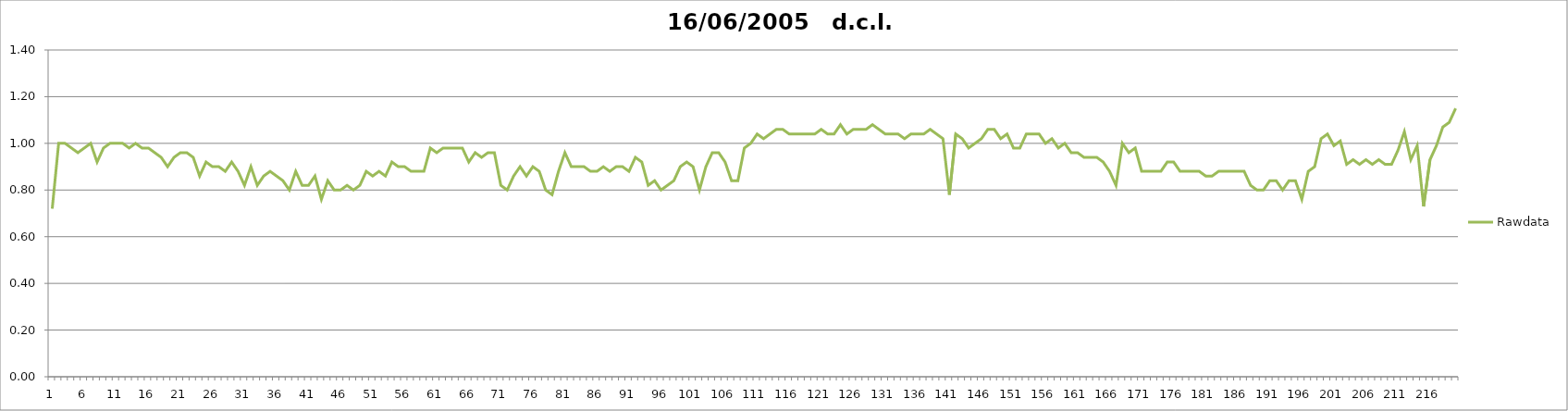
| Category | Rawdata |
|---|---|
| 0 | 0.72 |
| 1 | 1 |
| 2 | 1 |
| 3 | 0.98 |
| 4 | 0.96 |
| 5 | 0.98 |
| 6 | 1 |
| 7 | 0.92 |
| 8 | 0.98 |
| 9 | 1 |
| 10 | 1 |
| 11 | 1 |
| 12 | 0.98 |
| 13 | 1 |
| 14 | 0.98 |
| 15 | 0.98 |
| 16 | 0.96 |
| 17 | 0.94 |
| 18 | 0.9 |
| 19 | 0.94 |
| 20 | 0.96 |
| 21 | 0.96 |
| 22 | 0.94 |
| 23 | 0.86 |
| 24 | 0.92 |
| 25 | 0.9 |
| 26 | 0.9 |
| 27 | 0.88 |
| 28 | 0.92 |
| 29 | 0.88 |
| 30 | 0.82 |
| 31 | 0.9 |
| 32 | 0.82 |
| 33 | 0.86 |
| 34 | 0.88 |
| 35 | 0.86 |
| 36 | 0.84 |
| 37 | 0.8 |
| 38 | 0.88 |
| 39 | 0.82 |
| 40 | 0.82 |
| 41 | 0.86 |
| 42 | 0.76 |
| 43 | 0.84 |
| 44 | 0.8 |
| 45 | 0.8 |
| 46 | 0.82 |
| 47 | 0.8 |
| 48 | 0.82 |
| 49 | 0.88 |
| 50 | 0.86 |
| 51 | 0.88 |
| 52 | 0.86 |
| 53 | 0.92 |
| 54 | 0.9 |
| 55 | 0.9 |
| 56 | 0.88 |
| 57 | 0.88 |
| 58 | 0.88 |
| 59 | 0.98 |
| 60 | 0.96 |
| 61 | 0.98 |
| 62 | 0.98 |
| 63 | 0.98 |
| 64 | 0.98 |
| 65 | 0.92 |
| 66 | 0.96 |
| 67 | 0.94 |
| 68 | 0.96 |
| 69 | 0.96 |
| 70 | 0.82 |
| 71 | 0.8 |
| 72 | 0.86 |
| 73 | 0.9 |
| 74 | 0.86 |
| 75 | 0.9 |
| 76 | 0.88 |
| 77 | 0.8 |
| 78 | 0.78 |
| 79 | 0.88 |
| 80 | 0.96 |
| 81 | 0.9 |
| 82 | 0.9 |
| 83 | 0.9 |
| 84 | 0.88 |
| 85 | 0.88 |
| 86 | 0.9 |
| 87 | 0.88 |
| 88 | 0.9 |
| 89 | 0.9 |
| 90 | 0.88 |
| 91 | 0.94 |
| 92 | 0.92 |
| 93 | 0.82 |
| 94 | 0.84 |
| 95 | 0.8 |
| 96 | 0.82 |
| 97 | 0.84 |
| 98 | 0.9 |
| 99 | 0.92 |
| 100 | 0.9 |
| 101 | 0.8 |
| 102 | 0.9 |
| 103 | 0.96 |
| 104 | 0.96 |
| 105 | 0.92 |
| 106 | 0.84 |
| 107 | 0.84 |
| 108 | 0.98 |
| 109 | 1 |
| 110 | 1.04 |
| 111 | 1.02 |
| 112 | 1.04 |
| 113 | 1.06 |
| 114 | 1.06 |
| 115 | 1.04 |
| 116 | 1.04 |
| 117 | 1.04 |
| 118 | 1.04 |
| 119 | 1.04 |
| 120 | 1.06 |
| 121 | 1.04 |
| 122 | 1.04 |
| 123 | 1.08 |
| 124 | 1.04 |
| 125 | 1.06 |
| 126 | 1.06 |
| 127 | 1.06 |
| 128 | 1.08 |
| 129 | 1.06 |
| 130 | 1.04 |
| 131 | 1.04 |
| 132 | 1.04 |
| 133 | 1.02 |
| 134 | 1.04 |
| 135 | 1.04 |
| 136 | 1.04 |
| 137 | 1.06 |
| 138 | 1.04 |
| 139 | 1.02 |
| 140 | 0.78 |
| 141 | 1.04 |
| 142 | 1.02 |
| 143 | 0.98 |
| 144 | 1 |
| 145 | 1.02 |
| 146 | 1.06 |
| 147 | 1.06 |
| 148 | 1.02 |
| 149 | 1.04 |
| 150 | 0.98 |
| 151 | 0.98 |
| 152 | 1.04 |
| 153 | 1.04 |
| 154 | 1.04 |
| 155 | 1 |
| 156 | 1.02 |
| 157 | 0.98 |
| 158 | 1 |
| 159 | 0.96 |
| 160 | 0.96 |
| 161 | 0.94 |
| 162 | 0.94 |
| 163 | 0.94 |
| 164 | 0.92 |
| 165 | 0.88 |
| 166 | 0.82 |
| 167 | 1 |
| 168 | 0.96 |
| 169 | 0.98 |
| 170 | 0.88 |
| 171 | 0.88 |
| 172 | 0.88 |
| 173 | 0.88 |
| 174 | 0.92 |
| 175 | 0.92 |
| 176 | 0.88 |
| 177 | 0.88 |
| 178 | 0.88 |
| 179 | 0.88 |
| 180 | 0.86 |
| 181 | 0.86 |
| 182 | 0.88 |
| 183 | 0.88 |
| 184 | 0.88 |
| 185 | 0.88 |
| 186 | 0.88 |
| 187 | 0.82 |
| 188 | 0.8 |
| 189 | 0.8 |
| 190 | 0.84 |
| 191 | 0.84 |
| 192 | 0.8 |
| 193 | 0.84 |
| 194 | 0.84 |
| 195 | 0.76 |
| 196 | 0.88 |
| 197 | 0.9 |
| 198 | 1.02 |
| 199 | 1.04 |
| 200 | 0.99 |
| 201 | 1.01 |
| 202 | 0.91 |
| 203 | 0.93 |
| 204 | 0.91 |
| 205 | 0.93 |
| 206 | 0.91 |
| 207 | 0.93 |
| 208 | 0.91 |
| 209 | 0.91 |
| 210 | 0.97 |
| 211 | 1.05 |
| 212 | 0.93 |
| 213 | 0.99 |
| 214 | 0.73 |
| 215 | 0.93 |
| 216 | 0.99 |
| 217 | 1.07 |
| 218 | 1.09 |
| 219 | 1.15 |